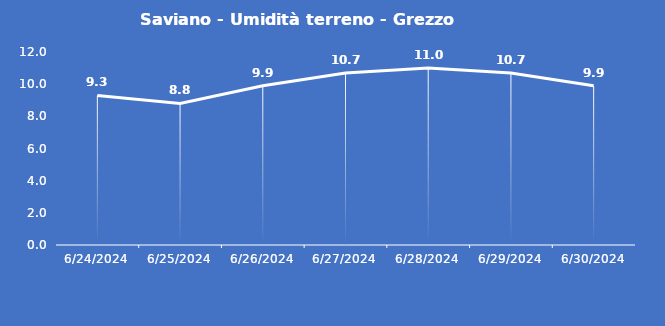
| Category | Saviano - Umidità terreno - Grezzo (%VWC) |
|---|---|
| 6/24/24 | 9.3 |
| 6/25/24 | 8.8 |
| 6/26/24 | 9.9 |
| 6/27/24 | 10.7 |
| 6/28/24 | 11 |
| 6/29/24 | 10.7 |
| 6/30/24 | 9.9 |